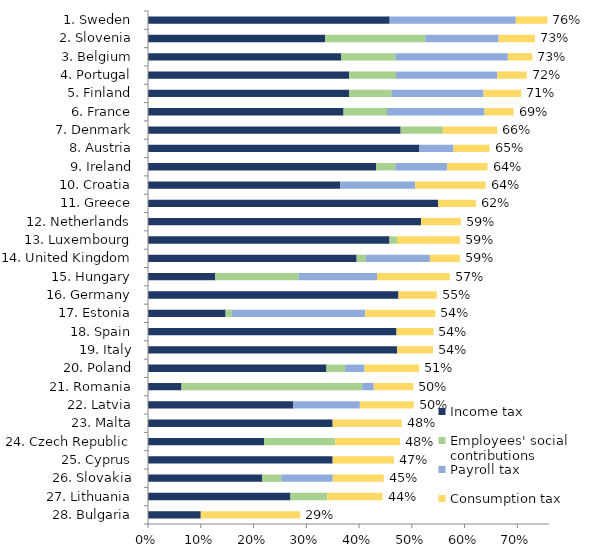
| Category | Income tax | Employees' social contributions | Payroll tax | Consumption tax | Effective marginal tax rate |
|---|---|---|---|---|---|
| 1. Sweden | 0.458 | 0 | 0.239 | 0.06 | 0.757 |
| 2. Slovenia | 0.335 | 0.19 | 0.139 | 0.069 | 0.733 |
| 3. Belgium | 0.366 | 0.103 | 0.213 | 0.046 | 0.729 |
| 4. Portugal | 0.381 | 0.089 | 0.192 | 0.056 | 0.718 |
| 5. Finland | 0.381 | 0.081 | 0.174 | 0.072 | 0.707 |
| 6. France | 0.371 | 0.082 | 0.185 | 0.055 | 0.693 |
| 7. Denmark | 0.479 | 0.08 | 0 | 0.103 | 0.662 |
| 8. Austria | 0.514 | 0 | 0.065 | 0.068 | 0.647 |
| 9. Ireland | 0.433 | 0.036 | 0.099 | 0.076 | 0.643 |
| 10. Croatia | 0.365 | 0 | 0.142 | 0.133 | 0.64 |
| 11. Greece | 0.55 | 0 | 0 | 0.072 | 0.622 |
| 12. Netherlands | 0.518 | 0 | 0 | 0.075 | 0.593 |
| 13. Luxembourg | 0.458 | 0.014 | 0 | 0.12 | 0.592 |
| 14. United Kingdom | 0.395 | 0.018 | 0.121 | 0.057 | 0.591 |
| 15. Hungary | 0.128 | 0.157 | 0.149 | 0.138 | 0.572 |
| 16. Germany | 0.475 | 0 | 0 | 0.073 | 0.547 |
| 17. Estonia | 0.147 | 0.012 | 0.253 | 0.133 | 0.545 |
| 18. Spain | 0.471 | 0 | 0 | 0.07 | 0.541 |
| 19. Italy | 0.472 | 0 | 0 | 0.068 | 0.54 |
| 20. Poland | 0.338 | 0.035 | 0.037 | 0.103 | 0.514 |
| 21. Romania | 0.064 | 0.342 | 0.022 | 0.075 | 0.503 |
| 22. Latvia | 0.275 | 0 | 0.127 | 0.102 | 0.504 |
| 23. Malta | 0.35 | 0 | 0 | 0.131 | 0.481 |
| 24. Czech Republic | 0.22 | 0.135 | 0 | 0.123 | 0.478 |
| 25. Cyprus | 0.35 | 0 | 0 | 0.116 | 0.466 |
| 26. Slovakia | 0.217 | 0.036 | 0.097 | 0.096 | 0.447 |
| 27. Lithuania | 0.27 | 0.07 | 0 | 0.105 | 0.445 |
| 28. Bulgaria | 0.1 | 0 | 0 | 0.188 | 0.288 |